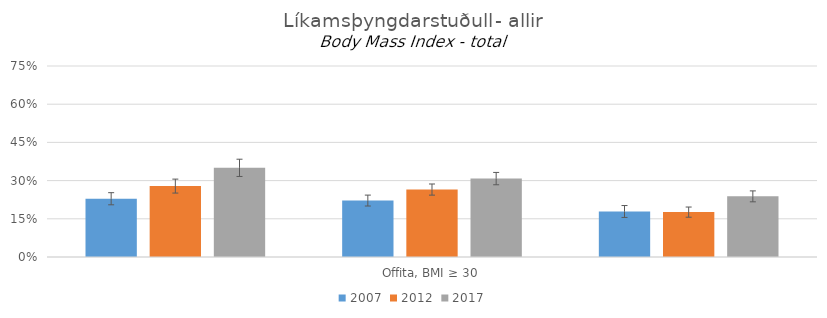
| Category | 2007 | 2012 | 2017 |
|---|---|---|---|
| 0 | 0.229 | 0.278 | 0.35 |
| 1 | 0.222 | 0.265 | 0.308 |
| 2 | 0.179 | 0.176 | 0.238 |